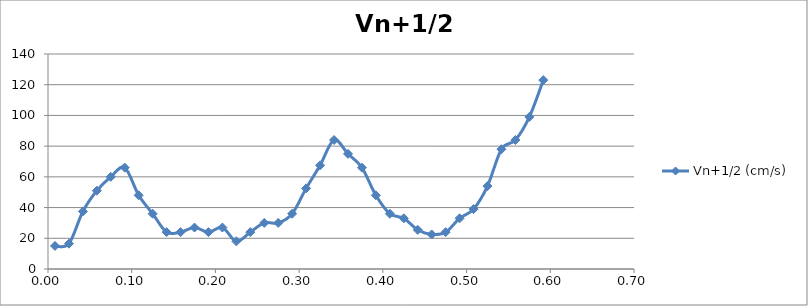
| Category | Vn+1/2 (cm/s) |
|---|---|
| 0.00833333333333333 | 15 |
| 0.025 | 16.5 |
| 0.0416666666666667 | 37.5 |
| 0.0583333333333333 | 51 |
| 0.075 | 60 |
| 0.0916666666666666 | 66 |
| 0.108333333333333 | 48 |
| 0.125 | 36 |
| 0.141666666666667 | 24 |
| 0.158333333333333 | 24 |
| 0.175 | 27 |
| 0.191666666666667 | 24 |
| 0.208333333333333 | 27 |
| 0.225 | 18 |
| 0.241666666666667 | 24 |
| 0.258333333333333 | 30 |
| 0.275 | 30 |
| 0.291666666666667 | 36 |
| 0.308333333333333 | 52.5 |
| 0.325 | 67.5 |
| 0.341666666666667 | 84 |
| 0.358333333333333 | 75 |
| 0.375 | 66 |
| 0.391666666666667 | 48 |
| 0.408333333333333 | 36 |
| 0.425 | 33 |
| 0.441666666666667 | 25.5 |
| 0.458333333333333 | 22.5 |
| 0.475 | 24 |
| 0.491666666666667 | 33 |
| 0.508333333333333 | 39 |
| 0.525 | 54 |
| 0.541666666666667 | 78 |
| 0.558333333333333 | 84 |
| 0.575 | 99 |
| 0.591666666666667 | 123 |